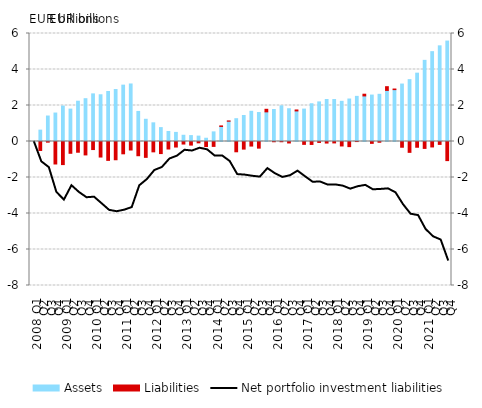
| Category | Assets | Liabilities |
|---|---|---|
| 2008 Q1 | 0 | 0 |
| Q2 | 0.631 | -0.498 |
| Q3 | 1.415 | -0.036 |
| Q4 | 1.581 | -1.249 |
| 2009 Q1 | 1.969 | -1.283 |
| Q2 | 1.8 | -0.655 |
| Q3 | 2.238 | -0.596 |
| Q4 | 2.378 | -0.745 |
| 2010 Q1 | 2.646 | -0.447 |
| Q2 | 2.595 | -0.863 |
| Q3 | 2.778 | -1.048 |
| Q4 | 2.887 | -1.014 |
| 2011 Q1 | 3.131 | -0.684 |
| Q2 | 3.196 | -0.473 |
| Q3 | 1.669 | -0.79 |
| Q4 | 1.235 | -0.881 |
| 2012 Q1 | 1.037 | -0.575 |
| Q2 | 0.771 | -0.671 |
| Q3 | 0.556 | -0.417 |
| Q4 | 0.505 | -0.308 |
| 2013 Q1 | 0.346 | -0.141 |
| Q2 | 0.328 | -0.2 |
| Q3 | 0.299 | -0.075 |
| Q4 | 0.181 | -0.281 |
| 2014 Q1 | 0.534 | -0.271 |
| Q2 | 0.835 | 0.031 |
| Q3 | 1.126 | 0.016 |
| Q4 | 1.267 | -0.571 |
| 2015 Q1 | 1.445 | -0.423 |
| Q2 | 1.678 | -0.254 |
| Q3 | 1.609 | -0.369 |
| Q4 | 1.647 | 0.142 |
| 2016 Q1 | 1.776 | -0.014 |
| Q2 | 1.981 | -0.014 |
| Q3 | 1.819 | -0.082 |
| Q4 | 1.699 | 0.052 |
| 2017 Q1 | 1.801 | -0.159 |
| Q2 | 2.097 | -0.164 |
| Q3 | 2.2 | -0.052 |
| Q4 | 2.333 | -0.087 |
| 2018 Q1 | 2.331 | -0.079 |
| Q2 | 2.232 | -0.248 |
| Q3 | 2.36 | -0.285 |
| Q4 | 2.507 | -0.003 |
| 2019 Q1 | 2.532 | 0.095 |
| Q2 | 2.579 | -0.103 |
| Q3 | 2.621 | -0.042 |
| Q4 | 2.838 | 0.207 |
| 2020 Q1 | 2.883 | 0.033 |
| Q2 | 3.191 | -0.319 |
| Q3 | 3.436 | -0.603 |
| Q4 | 3.796 | -0.32 |
| 2021 Q1 | 4.508 | -0.384 |
| Q2 | 4.992 | -0.303 |
| Q3 | 5.314 | -0.16 |
| Q4 | 5.579 | -1.062 |